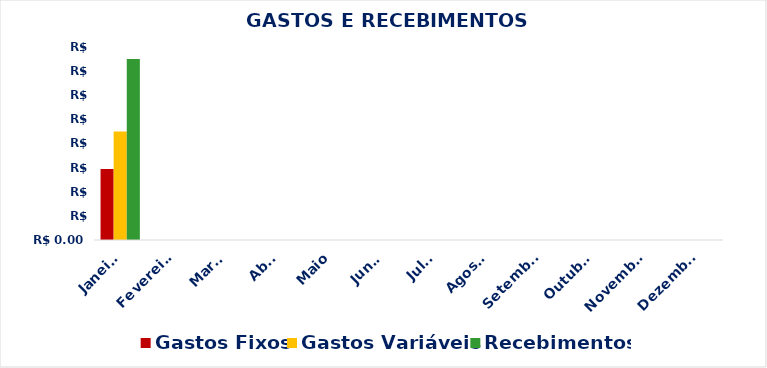
| Category | Gastos Fixos | Gastos Variáveis | Recebimentos |
|---|---|---|---|
| Janeiro | 2940 | 4500 | 7500 |
| Fevereiro | 0 | 0 | 0 |
| Março | 0 | 0 | 0 |
| Abril | 0 | 0 | 0 |
| Maio | 0 | 0 | 0 |
| Junho | 0 | 0 | 0 |
| Julho | 0 | 0 | 0 |
| Agosto | 0 | 0 | 0 |
| Setembro | 0 | 0 | 0 |
| Outubro | 0 | 0 | 0 |
| Novembro | 0 | 0 | 0 |
| Dezembro | 0 | 0 | 0 |